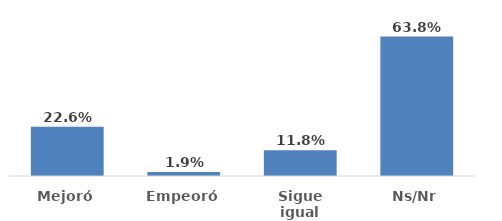
| Category | Series 0 |
|---|---|
| Mejoró | 0.226 |
| Empeoró | 0.019 |
| Sigue igual | 0.118 |
| Ns/Nr | 0.638 |